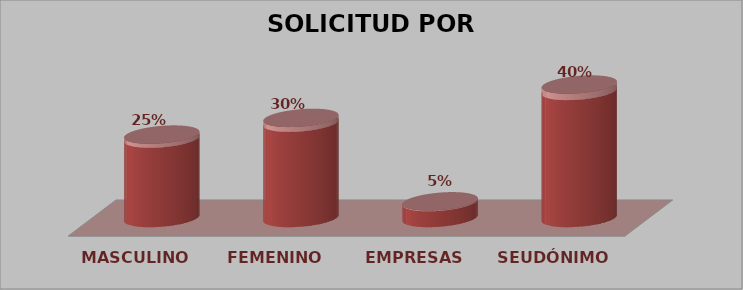
| Category | SOLICITUD POR SEXO | Series 1 |
|---|---|---|
| MASCULINO | 5 | 0.25 |
| FEMENINO | 6 | 0.3 |
| EMPRESAS | 1 | 0.05 |
| SEUDÓNIMO | 8 | 0.4 |